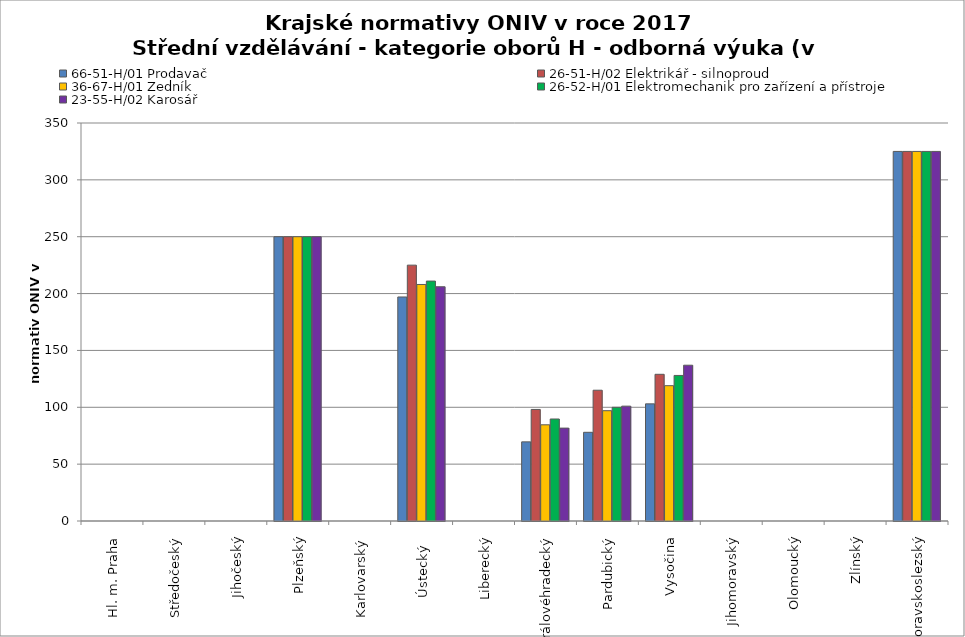
| Category | 66-51-H/01 Prodavač | 26-51-H/02 Elektrikář - silnoproud | 36-67-H/01 Zedník | 26-52-H/01 Elektromechanik pro zařízení a přístroje | 23-55-H/02 Karosář |
|---|---|---|---|---|---|
| Hl. m. Praha | 0 | 0 | 0 | 0 | 0 |
| Středočeský | 0 | 0 | 0 | 0 | 0 |
| Jihočeský | 0 | 0 | 0 | 0 | 0 |
| Plzeňský | 250 | 250 | 250 | 250 | 250 |
| Karlovarský  | 0 | 0 | 0 | 0 | 0 |
| Ústecký   | 197 | 225 | 208 | 211 | 206 |
| Liberecký | 0 | 0 | 0 | 0 | 0 |
| Královéhradecký | 69.6 | 98.1 | 84.6 | 89.7 | 81.7 |
| Pardubický | 78 | 115 | 97 | 100 | 101 |
| Vysočina | 103 | 129 | 119 | 128 | 137 |
| Jihomoravský | 0 | 0 | 0 | 0 | 0 |
| Olomoucký | 0 | 0 | 0 | 0 | 0 |
| Zlínský | 0 | 0 | 0 | 0 | 0 |
| Moravskoslezský | 325 | 325 | 325 | 325 | 325 |